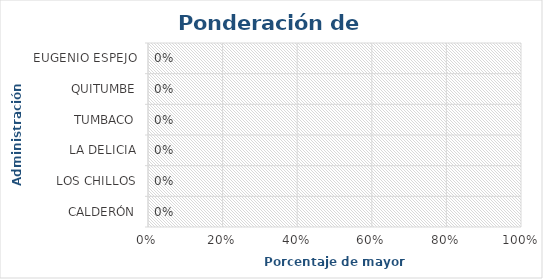
| Category | Series 0 |
|---|---|
| CALDERÓN | 0 |
| LOS CHILLOS | 0 |
| LA DELICIA | 0 |
| TUMBACO | 0 |
| QUITUMBE | 0 |
| EUGENIO ESPEJO | 0 |